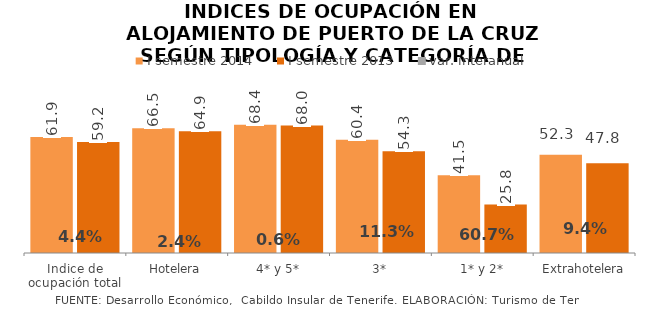
| Category | I semestre 2014 | I semestre 2013 |
|---|---|---|
| Indice de ocupación total | 61.87 | 59.237 |
| Hotelera | 66.488 | 64.929 |
| 4* y 5* | 68.384 | 67.98 |
| 3* | 60.385 | 54.252 |
| 1* y 2* | 41.508 | 25.824 |
| Extrahotelera | 52.335 | 47.831 |